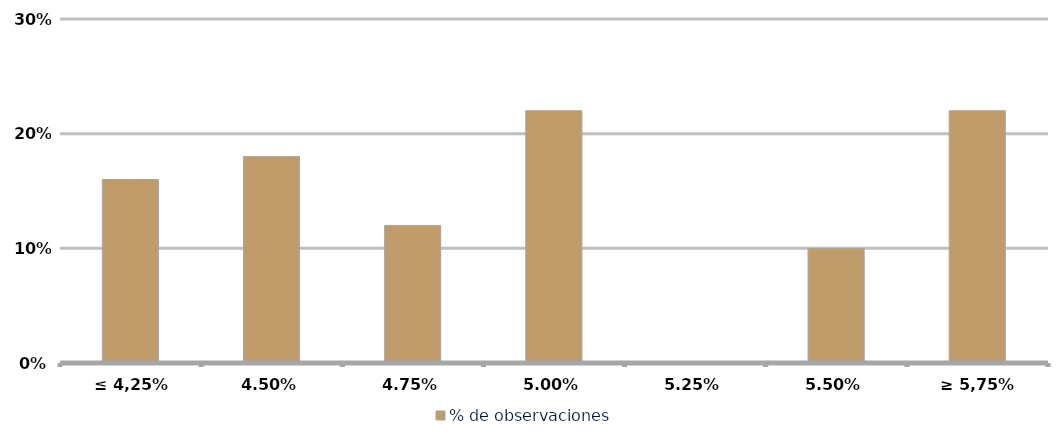
| Category | % de observaciones  |
|---|---|
| ≤ 4,25% | 0.16 |
| 4,50% | 0.18 |
| 4,75% | 0.12 |
| 5,00% | 0.22 |
| 5,25% | 0 |
| 5,50% | 0.1 |
| ≥ 5,75% | 0.22 |